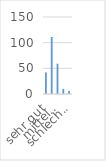
| Category | Series 0 |
|---|---|
| sehr gut | 42 |
| gut | 111 |
| mittelmäßig | 59 |
| mangelhaft | 10 |
| schlecht. | 6 |